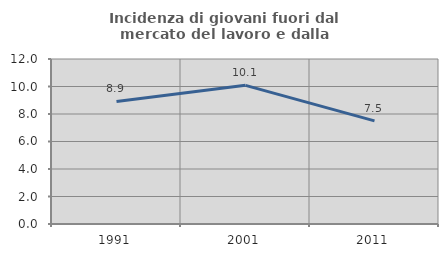
| Category | Incidenza di giovani fuori dal mercato del lavoro e dalla formazione  |
|---|---|
| 1991.0 | 8.911 |
| 2001.0 | 10.084 |
| 2011.0 | 7.5 |